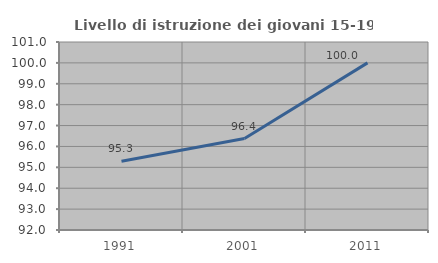
| Category | Livello di istruzione dei giovani 15-19 anni |
|---|---|
| 1991.0 | 95.29 |
| 2001.0 | 96.38 |
| 2011.0 | 100 |